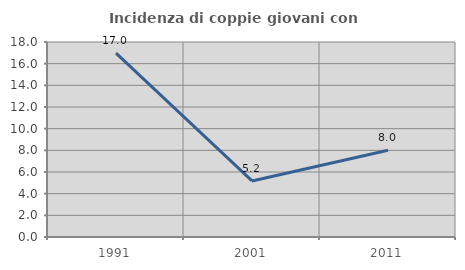
| Category | Incidenza di coppie giovani con figli |
|---|---|
| 1991.0 | 16.981 |
| 2001.0 | 5.172 |
| 2011.0 | 8 |